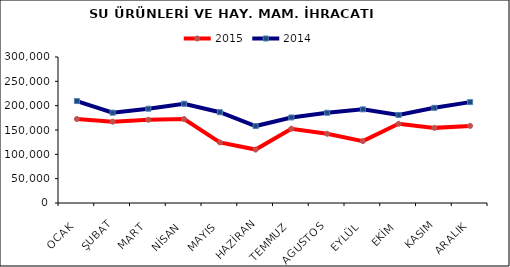
| Category | 2015 | 2014 |
|---|---|---|
| OCAK | 172543.833 | 209501.822 |
| ŞUBAT | 167106.447 | 185581.57 |
| MART | 171068.19 | 193720.274 |
| NİSAN | 172518.286 | 203888.599 |
| MAYIS | 124616.548 | 186505.359 |
| HAZİRAN | 109761.629 | 158084.996 |
| TEMMUZ | 152660.644 | 175807.642 |
| AGUSTOS | 142275.782 | 185391.333 |
| EYLÜL | 127152.118 | 192426.748 |
| EKİM | 162803.944 | 180876.823 |
| KASIM | 154376.646 | 195566.351 |
| ARALIK | 158438.243 | 207235.309 |